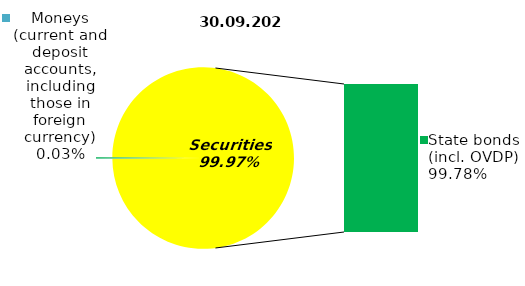
| Category | Series 0 |
|---|---|
| Moneys (current and deposit accounts, including those in foreign currency) | 0.05 |
| Bank metals | 0 |
| Real estate | 0 |
| Other assets | 0.31 |
| Equities | 0 |
| Corporate bonds | 0 |
| Municipal bonds | 0 |
| State bonds (incl. OVDP) | 161.605 |
| Mortgage Certificates | 0 |